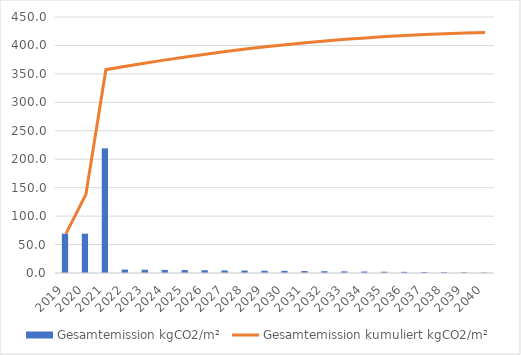
| Category | Gesamtemission |
|---|---|
| 2019.0 | 69.143 |
| 2020.0 | 69.143 |
| 2021.0 | 219.143 |
| 2022.0 | 6.029 |
| 2023.0 | 5.74 |
| 2024.0 | 5.451 |
| 2025.0 | 5.162 |
| 2026.0 | 4.873 |
| 2027.0 | 4.584 |
| 2028.0 | 4.295 |
| 2029.0 | 4.006 |
| 2030.0 | 3.717 |
| 2031.0 | 3.427 |
| 2032.0 | 3.138 |
| 2033.0 | 2.849 |
| 2034.0 | 2.56 |
| 2035.0 | 2.271 |
| 2036.0 | 1.982 |
| 2037.0 | 1.693 |
| 2038.0 | 1.404 |
| 2039.0 | 1.115 |
| 2040.0 | 0.826 |